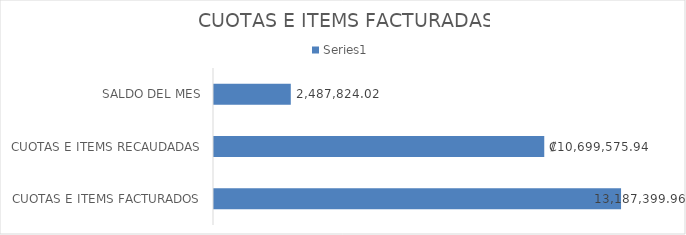
| Category | Series 0 |
|---|---|
| CUOTAS E ITEMS FACTURADOS | 13187399.96 |
| CUOTAS E ITEMS RECAUDADAS | 10699575.94 |
| SALDO DEL MES | 2487824.02 |